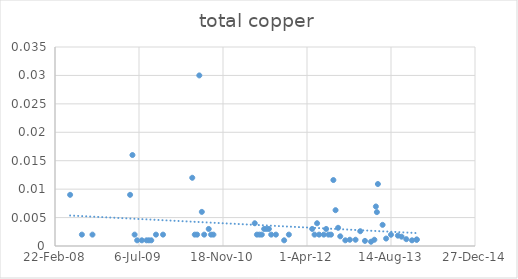
| Category | Series 0 |
|---|---|
| 39590.0 | 0.009 |
| 39660.0 | 0.002 |
| 39723.0 | 0.002 |
| 39947.0 | 0.009 |
| 39961.0 | 0.016 |
| 39974.0 | 0.002 |
| 39989.0 | 0.001 |
| 40017.0 | 0.001 |
| 40045.0 | 0.001 |
| 40059.0 | 0.001 |
| 40073.0 | 0.001 |
| 40101.0 | 0.002 |
| 40143.0 | 0.002 |
| 40317.0 | 0.012 |
| 40332.0 | 0.002 |
| 40346.0 | 0.002 |
| 40359.0 | 0.03 |
| 40374.0 | 0.006 |
| 40388.0 | 0.002 |
| 40415.0 | 0.003 |
| 40429.0 | 0.002 |
| 40443.0 | 0.002 |
| 40689.0 | 0.004 |
| 40702.0 | 0.002 |
| 40717.0 | 0.002 |
| 40731.0 | 0.002 |
| 40745.0 | 0.003 |
| 40759.0 | 0.003 |
| 40773.0 | 0.003 |
| 40787.0 | 0.002 |
| 40815.0 | 0.002 |
| 40864.0 | 0.001 |
| 40892.0 | 0.002 |
| 41031.0 | 0.003 |
| 41045.0 | 0.002 |
| 41060.0 | 0.004 |
| 41072.0 | 0.002 |
| 41100.0 | 0.002 |
| 41114.0 | 0.003 |
| 41128.0 | 0.002 |
| 41143.0 | 0.002 |
| 41157.0 | 0.012 |
| 41170.0 | 0.006 |
| 41185.0 | 0.003 |
| 41198.0 | 0.002 |
| 41228.0 | 0.001 |
| 41255.0 | 0.001 |
| 41289.0 | 0.001 |
| 41317.0 | 0.003 |
| 41345.0 | 0.001 |
| 41381.0 | 0.001 |
| 41401.0 | 0.001 |
| 41410.0 | 0.007 |
| 41416.0 | 0.006 |
| 41422.0 | 0.011 |
| 41450.0 | 0.004 |
| 41471.0 | 0.001 |
| 41500.0 | 0.002 |
| 41541.0 | 0.002 |
| 41563.0 | 0.002 |
| 41591.0 | 0.001 |
| 41625.0 | 0.001 |
| 41653.0 | 0.001 |
| 41653.0 | 0.001 |